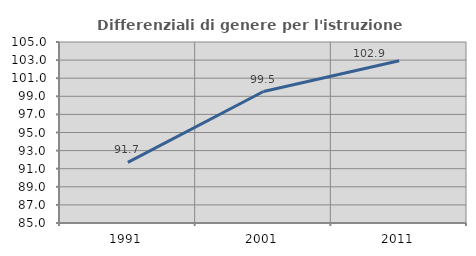
| Category | Differenziali di genere per l'istruzione superiore |
|---|---|
| 1991.0 | 91.707 |
| 2001.0 | 99.528 |
| 2011.0 | 102.919 |